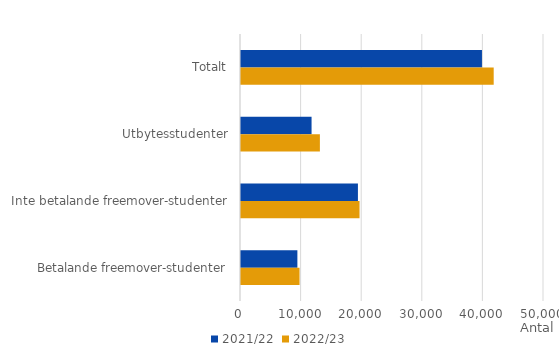
| Category | 2021/22 | 2022/23 |
|---|---|---|
| Totalt | 39762 | 41699 |
| Utbytesstudenter | 11644 | 13018 |
| Inte betalande freemover-studenter | 19295 | 19559 |
| Betalande freemover-studenter | 9304 | 9661 |